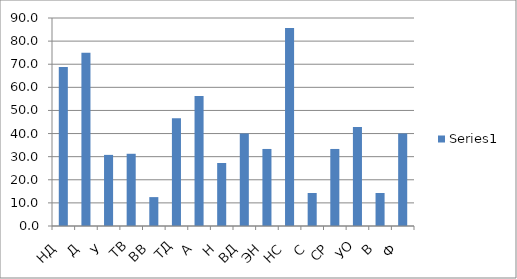
| Category | Series 0 |
|---|---|
| НД  | 68.75 |
| Д  | 75 |
| У  | 30.769 |
| ТВ  | 31.25 |
| ВВ  | 12.5 |
| ТД  | 46.667 |
| А  | 56.25 |
| Н  | 27.273 |
| ВД  | 40 |
| ЭН  | 33.333 |
| НС  | 85.714 |
| С  | 14.286 |
| СР  | 33.333 |
| УО  | 42.857 |
| В  | 14.286 |
| Ф  | 40 |